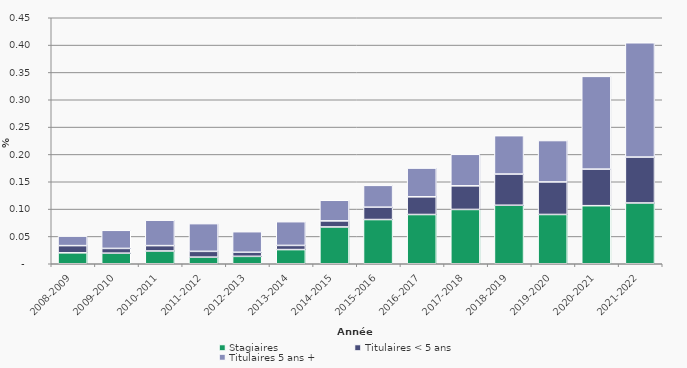
| Category | Stagiaires | Titulaires < 5 ans | Titulaires 5 ans + |
|---|---|---|---|
| 2008-2009 | 0.02 | 0.013 | 0.017 |
| 2009-2010 | 0.019 | 0.009 | 0.033 |
| 2010-2011 | 0.023 | 0.01 | 0.047 |
| 2011-2012 | 0.012 | 0.011 | 0.051 |
| 2012-2013 | 0.014 | 0.007 | 0.038 |
| 2013-2014 | 0.026 | 0.008 | 0.043 |
| 2014-2015 | 0.067 | 0.011 | 0.038 |
| 2015-2016 | 0.081 | 0.023 | 0.04 |
| 2016-2017 | 0.09 | 0.032 | 0.053 |
| 2017-2018 | 0.099 | 0.043 | 0.058 |
| 2018-2019 | 0.107 | 0.057 | 0.07 |
| 2019-2020 | 0.09 | 0.06 | 0.076 |
| 2020-2021 | 0.106 | 0.067 | 0.17 |
| 2021-2022 | 0.111 | 0.084 | 0.209 |